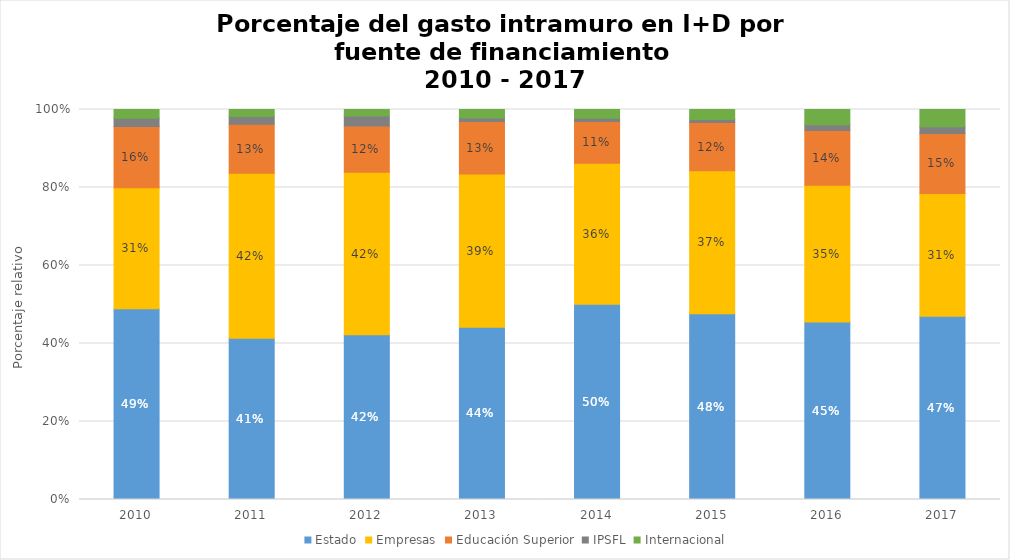
| Category | Estado | Empresas | Educación Superior | IPSFL | Internacional |
|---|---|---|---|---|---|
| 2010.0 | 0.489 | 0.31 | 0.158 | 0.021 | 0.023 |
| 2011.0 | 0.414 | 0.423 | 0.126 | 0.02 | 0.018 |
| 2012.0 | 0.422 | 0.417 | 0.119 | 0.025 | 0.017 |
| 2013.0 | 0.442 | 0.393 | 0.135 | 0.009 | 0.022 |
| 2014.0 | 0.501 | 0.361 | 0.107 | 0.008 | 0.022 |
| 2015.0 | 0.476 | 0.366 | 0.124 | 0.007 | 0.026 |
| 2016.0 | 0.455 | 0.351 | 0.141 | 0.014 | 0.039 |
| 2017.0 | 0.47 | 0.314 | 0.154 | 0.017 | 0.045 |